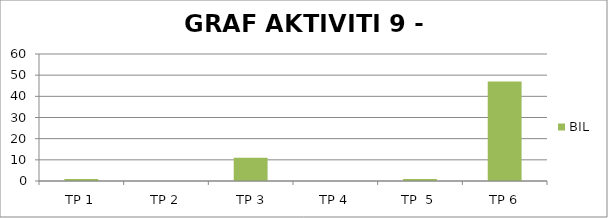
| Category | BIL |
|---|---|
| TP 1 | 1 |
| TP 2 | 0 |
|  TP 3 | 11 |
| TP 4 | 0 |
| TP  5 | 1 |
| TP 6 | 47 |